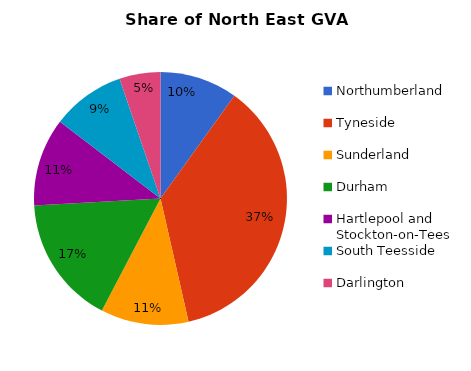
| Category | Series 0 |
|---|---|
| Northumberland | 4733 |
| Tyneside | 17420 |
| Sunderland | 5356 |
| Durham | 7852 |
| Hartlepool and Stockton-on-Tees | 5368 |
| South Teesside | 4472 |
| Darlington | 2502 |